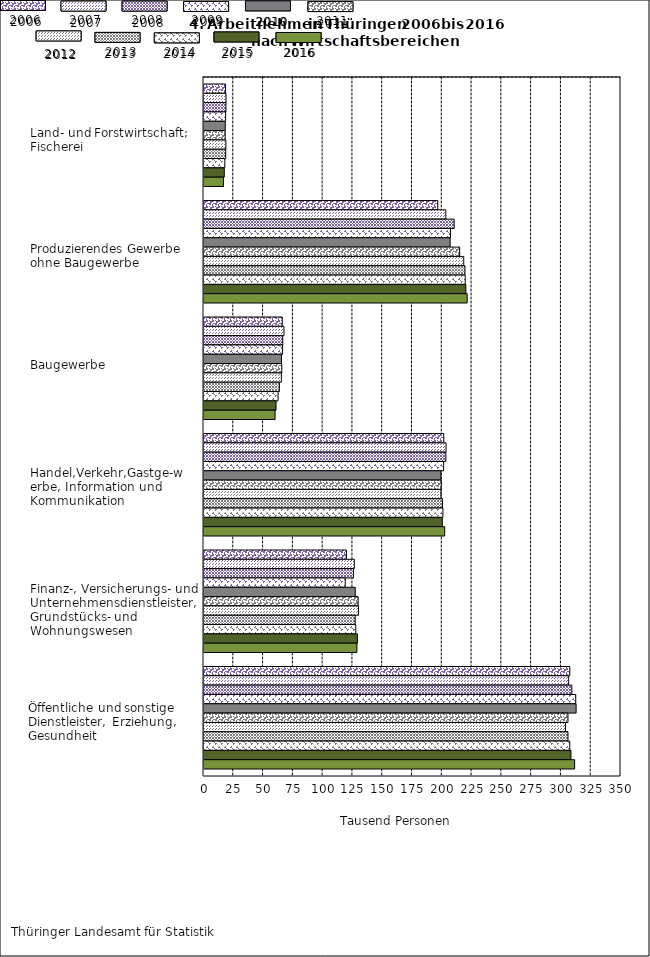
| Category | Series 3 | Series 4 | Series 5 | Series 6 | Series 7 | Series 8 | Series 9 | Series 10 | Series 11 | Series 12 | Series 13 |
|---|---|---|---|---|---|---|---|---|---|---|---|
| Land-und Forstwirtschaft; Fischerei | 18.004 | 18.466 | 18.427 | 18.142 | 17.853 | 17.767 | 18.378 | 18.207 | 17.491 | 17.027 | 16.4 |
| Produzierendes Gewerbe ohne Baugewerbe | 196.212 | 202.973 | 209.981 | 206.89 | 206.593 | 214.603 | 218.003 | 219.016 | 219.237 | 219.769 | 220.901 |
| Baugewerbe | 65.663 | 67.112 | 66.102 | 65.992 | 65.035 | 65.29 | 64.926 | 63.267 | 62.139 | 60.459 | 59.656 |
| Handel, Verkehr, Gastgewerbe, Information und Kommunikation | 201.235 | 203.157 | 203.006 | 201.126 | 198.813 | 199.151 | 198.859 | 200.187 | 200.527 | 200.016 | 202.049 |
| Finanz-, Versicherungs- und Unternehmensdienstl., Grundstücks- und Wohnungswesen | 119.53 | 126.184 | 125.413 | 118.529 | 126.972 | 129.354 | 129.692 | 126.89 | 127.377 | 128.778 | 128.346 |
| Öffentliche und sonstige Dienstleister, Erziehung, Gesundheit | 307.031 | 306.081 | 308.765 | 312.012 | 312.335 | 305.49 | 303.382 | 305.495 | 307.006 | 308.005 | 311.089 |